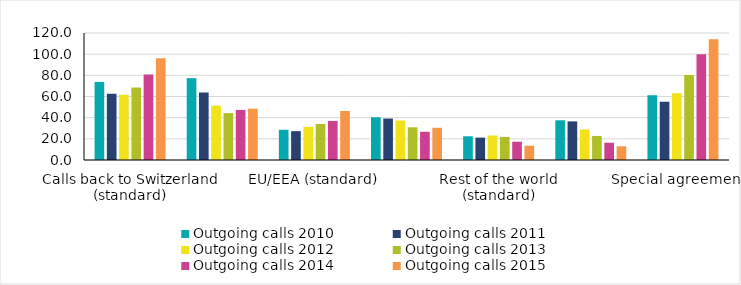
| Category | Outgoing calls 2010 | Outgoing calls 2011 | Outgoing calls 2012 | Outgoing calls 2013 | Outgoing calls 2014 | Outgoing calls 2015 |
|---|---|---|---|---|---|---|
| Calls back to Switzerland (standard) | 73.774 | 62.591 | 61.599 | 68.448 | 80.885 | 96.073 |
| Calls back to Switzerland (option) | 77.326 | 63.793 | 51.308 | 44.329 | 47.316 | 48.507 |
| EU/EEA (standard) | 28.543 | 27.257 | 31.313 | 34.06 | 36.916 | 46.323 |
| EU/EEA (option) | 40.383 | 39.164 | 37.376 | 30.894 | 26.656 | 30.41 |
| Rest of the world (standard) | 22.414 | 21.149 | 23.121 | 21.799 | 17.282 | 13.47 |
| Rest of the world (option) | 37.53 | 36.482 | 28.821 | 22.713 | 16.304 | 12.94 |
| Special agreements | 61.188 | 55.062 | 63.073 | 80.293 | 99.813 | 114.141 |